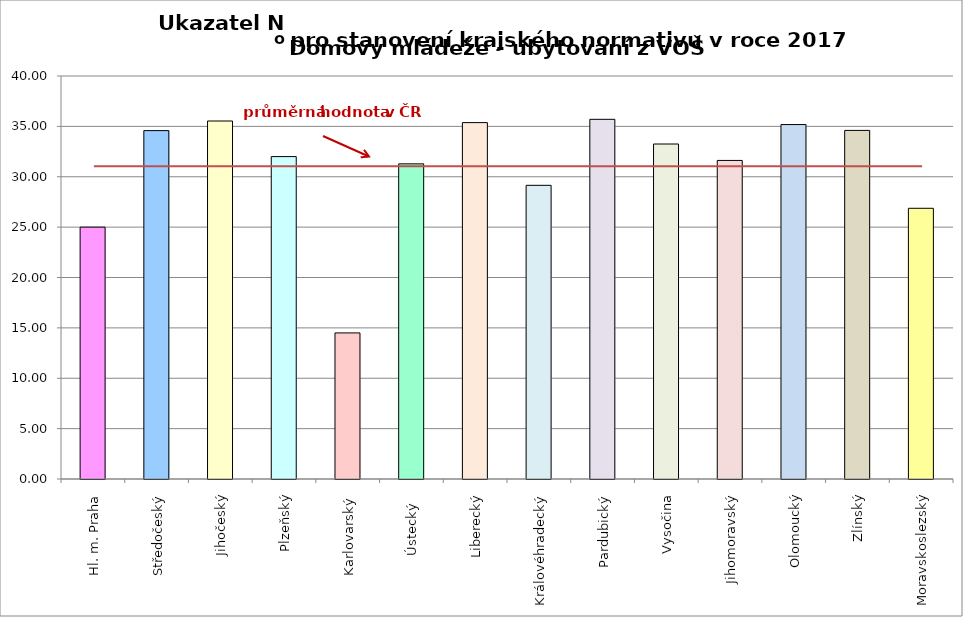
| Category | Series 0 |
|---|---|
| Hl. m. Praha | 25 |
| Středočeský | 34.58 |
| Jihočeský | 35.532 |
| Plzeňský | 32 |
| Karlovarský  | 14.5 |
| Ústecký   | 31.28 |
| Liberecký | 35.374 |
| Královéhradecký | 29.15 |
| Pardubický | 35.7 |
| Vysočina | 33.25 |
| Jihomoravský | 31.62 |
| Olomoucký | 35.18 |
| Zlínský | 34.6 |
| Moravskoslezský | 26.87 |